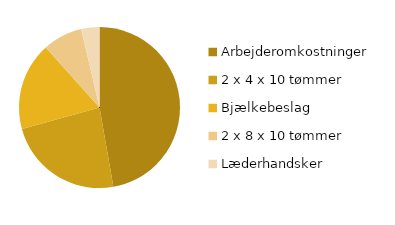
| Category | Series 0 |
|---|---|
| Arbejderomkostninger | 200 |
| 2 x 4 x 10 tømmer | 99.4 |
| Bjælkebeslag | 74.7 |
| 2 x 8 x 10 tømmer | 33.75 |
| Læderhandsker | 15.5 |